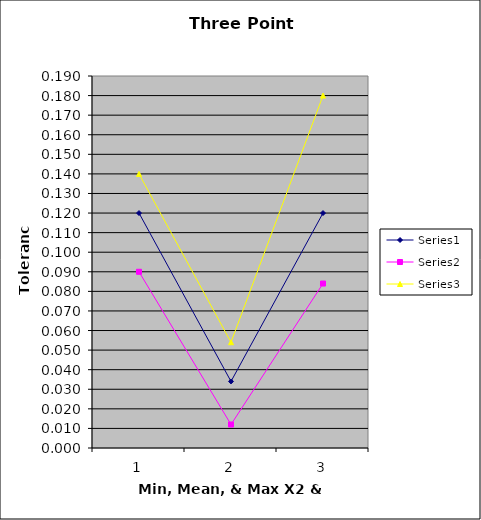
| Category | Series 0 | Series 1 | Series 2 |
|---|---|---|---|
| 0 | 0.12 | 0.09 | 0.14 |
| 1 | 0.034 | 0.012 | 0.054 |
| 2 | 0.12 | 0.084 | 0.18 |